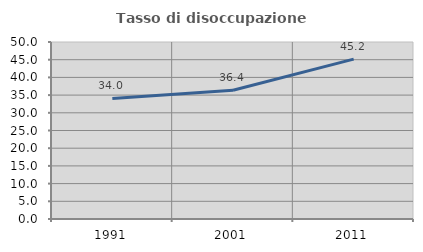
| Category | Tasso di disoccupazione giovanile  |
|---|---|
| 1991.0 | 34.043 |
| 2001.0 | 36.364 |
| 2011.0 | 45.161 |